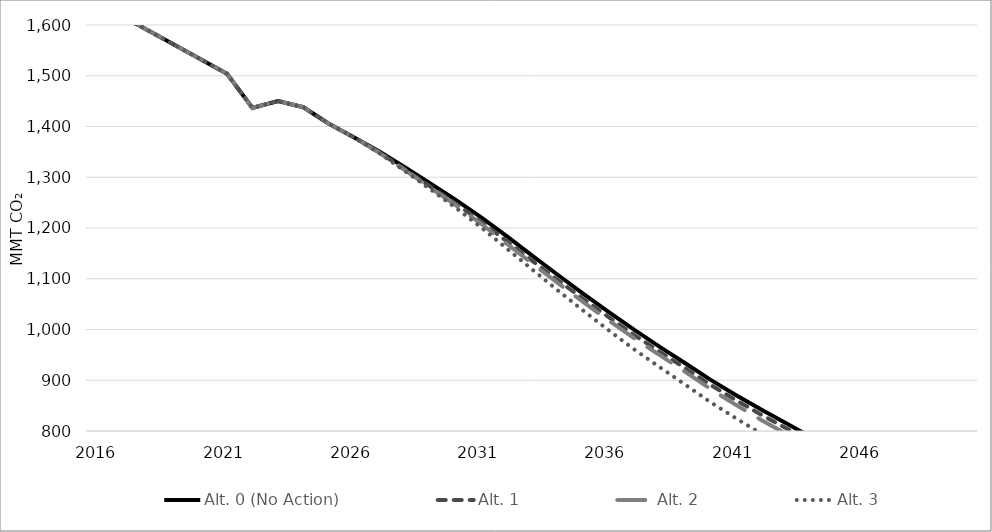
| Category | Alt. 0 (No Action) | Alt. 1 | Alt. 2 | Alt. 3 |
|---|---|---|---|---|
| 2016.0 | 1641.576 | 1641.576 | 1641.576 | 1641.576 |
| 2017.0 | 1614.032 | 1614.032 | 1614.032 | 1614.032 |
| 2018.0 | 1586.488 | 1586.488 | 1586.488 | 1586.488 |
| 2019.0 | 1558.944 | 1558.944 | 1558.944 | 1558.944 |
| 2020.0 | 1531.4 | 1531.4 | 1531.4 | 1531.4 |
| 2021.0 | 1503.856 | 1503.856 | 1503.856 | 1503.856 |
| 2022.0 | 1436.757 | 1436.757 | 1436.757 | 1436.757 |
| 2023.0 | 1450.133 | 1450.133 | 1450.133 | 1450.133 |
| 2024.0 | 1438.015 | 1438.015 | 1438.015 | 1438.015 |
| 2025.0 | 1405.595 | 1405.595 | 1405.595 | 1405.595 |
| 2026.0 | 1378.201 | 1378.201 | 1378.201 | 1378.201 |
| 2027.0 | 1350.345 | 1348.344 | 1347.694 | 1346.87 |
| 2028.0 | 1319.186 | 1315.145 | 1313.64 | 1311.746 |
| 2029.0 | 1287.335 | 1281.248 | 1278.879 | 1275.835 |
| 2030.0 | 1255.016 | 1247.696 | 1244.408 | 1239.313 |
| 2031.0 | 1220.561 | 1211.959 | 1207.811 | 1200.457 |
| 2032.0 | 1183.349 | 1173.446 | 1168.385 | 1159.086 |
| 2033.0 | 1145.247 | 1135.02 | 1129.552 | 1117.77 |
| 2034.0 | 1107.354 | 1097.131 | 1091.231 | 1076.762 |
| 2035.0 | 1070.324 | 1060.13 | 1053.863 | 1036.939 |
| 2036.0 | 1034.398 | 1024.048 | 1017.624 | 998.075 |
| 2037.0 | 999.132 | 988.897 | 982.32 | 960.602 |
| 2038.0 | 965.859 | 955.987 | 949.469 | 925.632 |
| 2039.0 | 933.605 | 923.824 | 916.517 | 891.308 |
| 2040.0 | 900.773 | 890.665 | 882.524 | 856.441 |
| 2041.0 | 870.56 | 860.487 | 851.07 | 824.711 |
| 2042.0 | 841.714 | 831.652 | 821.336 | 794.481 |
| 2043.0 | 814.258 | 804.421 | 793.355 | 766.225 |
| 2044.0 | 786.663 | 776.923 | 764.78 | 737.918 |
| 2045.0 | 757.102 | 748.471 | 735.718 | 709.656 |
| 2046.0 | 726.731 | 719.567 | 706.779 | 680.562 |
| 2047.0 | 697.172 | 691.495 | 678.631 | 652.402 |
| 2048.0 | 668.744 | 664.508 | 651.649 | 625.116 |
| 2049.0 | 638.862 | 635.883 | 623.181 | 596.738 |
| 2050.0 | 608.103 | 606.14 | 593.898 | 567.723 |